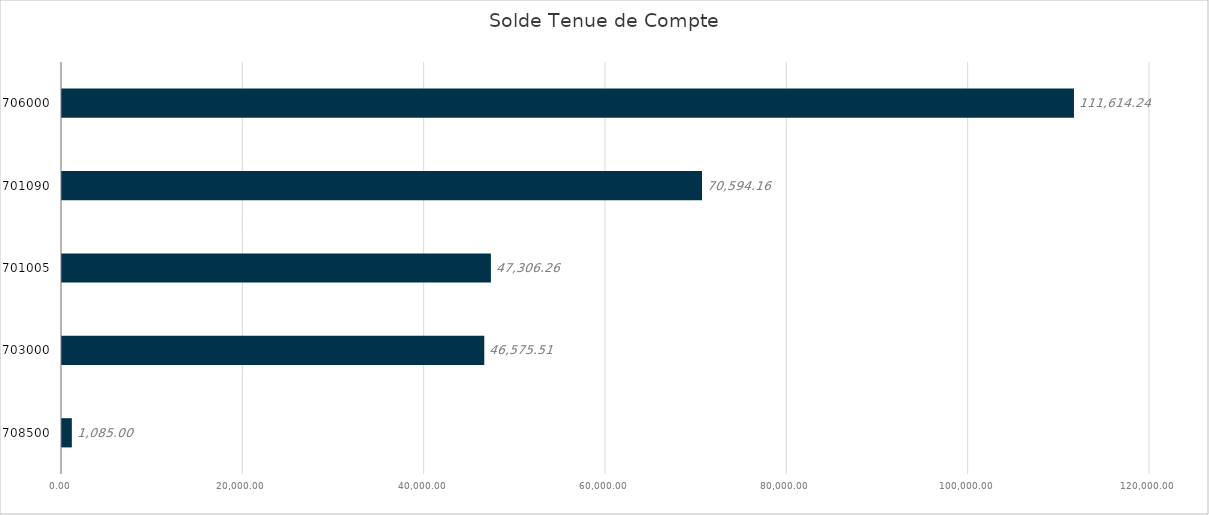
| Category | Solde Tenue de Compte |
|---|---|
| 708500 | 1085 |
| 703000 | 46575.51 |
| 701005 | 47306.26 |
| 701090 | 70594.16 |
| 706000 | 111614.24 |